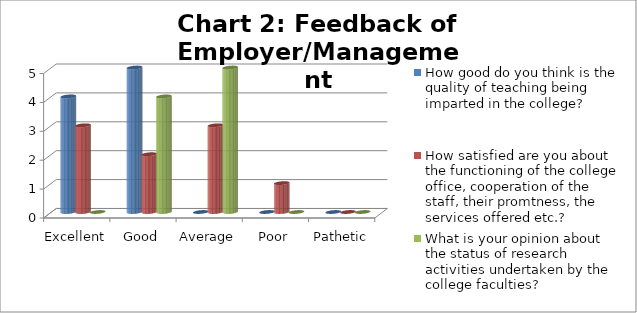
| Category | How good do you think is the quality of teaching being imparted in the college? | How satisfied are you about the functioning of the college office, cooperation of the staff, their promtness, the services offered etc.? | What is your opinion about the status of research activities undertaken by the college faculties? |
|---|---|---|---|
| Excellent | 4 | 3 | 0 |
| Good | 5 | 2 | 4 |
| Average | 0 | 3 | 5 |
| Poor | 0 | 1 | 0 |
| Pathetic | 0 | 0 | 0 |